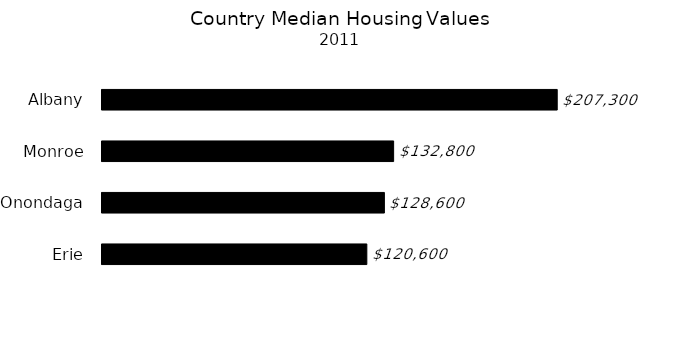
| Category | Series 0 |
|---|---|
| Erie | 120600 |
| Onondaga | 128600 |
| Monroe | 132800 |
| Albany | 207300 |